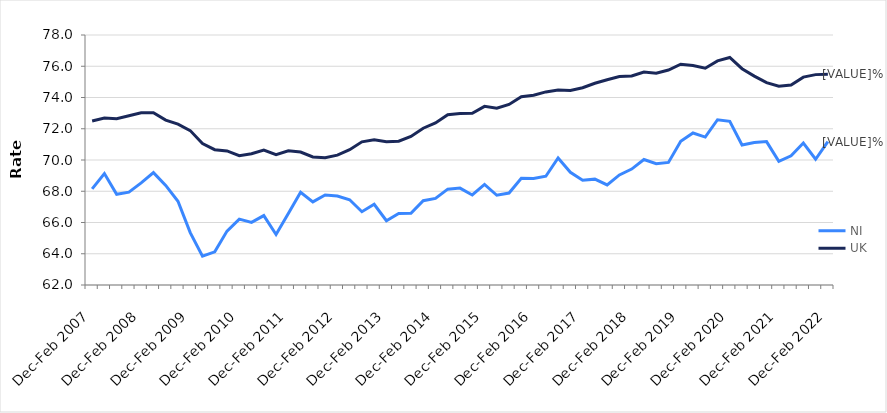
| Category | NI | UK |
|---|---|---|
| Dec-Feb 2007 | 68.154 | 72.499 |
| Mar-May 2007 | 69.129 | 72.691 |
| Jun-Aug 2007 | 67.802 | 72.644 |
| Sep-Nov 2007 | 67.944 | 72.83 |
| Dec-Feb 2008 | 68.532 | 73.021 |
| Mar-May 2008 | 69.193 | 73.027 |
| Jun-Aug 2008 | 68.372 | 72.555 |
| Sep-Nov 2008 | 67.357 | 72.291 |
| Dec-Feb 2009 | 65.352 | 71.882 |
| Mar-May 2009 | 63.847 | 71.049 |
| Jun-Aug 2009 | 64.122 | 70.661 |
| Sep-Nov 2009 | 65.451 | 70.579 |
| Dec-Feb 2010 | 66.217 | 70.28 |
| Mar-May 2010 | 66.009 | 70.398 |
| Jun-Aug 2010 | 66.442 | 70.639 |
| Sep-Nov 2010 | 65.232 | 70.339 |
| Dec-Feb 2011 | 66.574 | 70.586 |
| Mar-May 2011 | 67.937 | 70.512 |
| Jun-Aug 2011 | 67.32 | 70.195 |
| Sep-Nov 2011 | 67.762 | 70.145 |
| Dec-Feb 2012 | 67.69 | 70.313 |
| Mar-May 2012 | 67.458 | 70.66 |
| Jun-Aug 2012 | 66.691 | 71.164 |
| Sep-Nov 2012 | 67.167 | 71.29 |
| Dec-Feb 2013 | 66.112 | 71.163 |
| Mar-May 2013 | 66.574 | 71.205 |
| Jun-Aug 2013 | 66.587 | 71.509 |
| Sep-Nov 2013 | 67.397 | 72.034 |
| Dec-Feb 2014 | 67.54 | 72.373 |
| Mar-May 2014 | 68.133 | 72.903 |
| Jun-Aug 2014 | 68.203 | 72.974 |
| Sep-Nov 2014 | 67.762 | 72.993 |
| Dec-Feb 2015 | 68.44 | 73.433 |
| Mar-May 2015 | 67.744 | 73.309 |
| Jun-Aug 2015 | 67.887 | 73.559 |
| Sep-Nov 2015 | 68.833 | 74.049 |
| Dec-Feb 2016 | 68.816 | 74.14 |
| Mar-May 2016 | 68.959 | 74.357 |
| Jun-Aug 2016 | 70.127 | 74.486 |
| Sep-Nov 2016 | 69.214 | 74.447 |
| Dec-Feb 2017 | 68.706 | 74.624 |
| Mar-May 2017 | 68.774 | 74.909 |
| Jun-Aug 2017 | 68.402 | 75.138 |
| Sep-Nov 2017 | 69.045 | 75.338 |
| Dec-Feb 2018 | 69.419 | 75.375 |
| Mar-May 2018 | 70.029 | 75.632 |
| Jun-Aug 2018 | 69.765 | 75.557 |
| Sep-Nov 2018 | 69.845 | 75.761 |
| Dec-Feb 2019 | 71.196 | 76.127 |
| Mar-May 2019 | 71.727 | 76.049 |
| Jun-Aug 2019 | 71.467 | 75.874 |
| Sep-Nov 2019 | 72.576 | 76.343 |
| Dec-Feb 2020 | 72.473 | 76.562 |
| Mar-May 2020 | 70.959 | 75.842 |
| Jun-Aug 2020 | 71.117 | 75.37 |
| Sep-Nov 2020 | 71.178 | 74.949 |
| Dec-Feb 2021 | 69.913 | 74.721 |
| Mar-May 2021 | 70.264 | 74.805 |
| Jun-Aug 2021 | 71.083 | 75.304 |
| Sep-Nov 2021 | 70.047 | 75.464 |
| Dec-Feb 2022 | 71.171 | 75.486 |